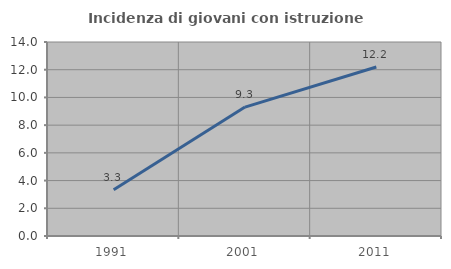
| Category | Incidenza di giovani con istruzione universitaria |
|---|---|
| 1991.0 | 3.333 |
| 2001.0 | 9.302 |
| 2011.0 | 12.195 |